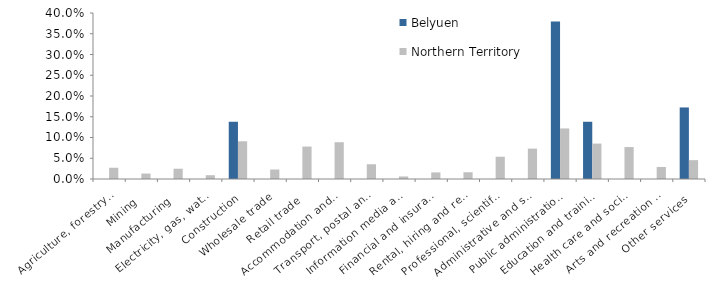
| Category | Belyuen | Northern Territory |
|---|---|---|
| Agriculture, forestry and fishing | 0 | 0.027 |
| Mining | 0 | 0.013 |
| Manufacturing | 0 | 0.025 |
| Electricity, gas, water and waste services | 0 | 0.009 |
| Construction | 0.138 | 0.091 |
| Wholesale trade | 0 | 0.023 |
| Retail trade | 0 | 0.078 |
| Accommodation and food services | 0 | 0.089 |
| Transport, postal and warehousing | 0 | 0.036 |
| Information media and telecommunications | 0 | 0.006 |
| Financial and insurance services | 0 | 0.016 |
| Rental, hiring and real estate services | 0 | 0.016 |
| Professional, scientific and technical services | 0 | 0.054 |
| Administrative and support services | 0 | 0.073 |
| Public administration and safety | 0.379 | 0.122 |
| Education and training | 0.138 | 0.085 |
| Health care and social assistance | 0 | 0.077 |
| Arts and recreation services | 0 | 0.029 |
| Other services | 0.172 | 0.045 |